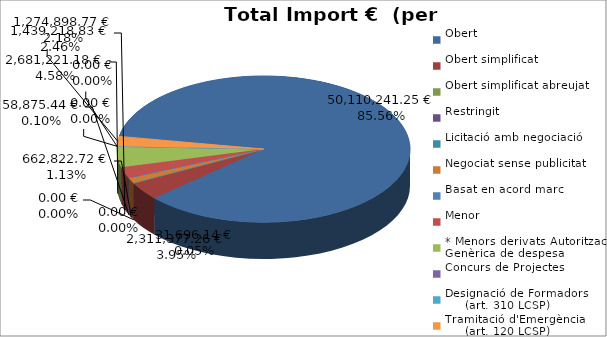
| Category | Total preu
(amb IVA) |
|---|---|
| Obert | 50110241.253 |
| Obert simplificat | 2311377.255 |
| Obert simplificat abreujat | 31696.14 |
| Restringit | 0 |
| Licitació amb negociació | 0 |
| Negociat sense publicitat | 662822.718 |
| Basat en acord marc | 58875.438 |
| Menor | 1439218.83 |
| * Menors derivats Autorització Genèrica de despesa | 2681221.18 |
| Concurs de Projectes | 0 |
| Designació de Formadors
     (art. 310 LCSP) | 0 |
| Tramitació d'Emergència
     (art. 120 LCSP) | 1274898.774 |